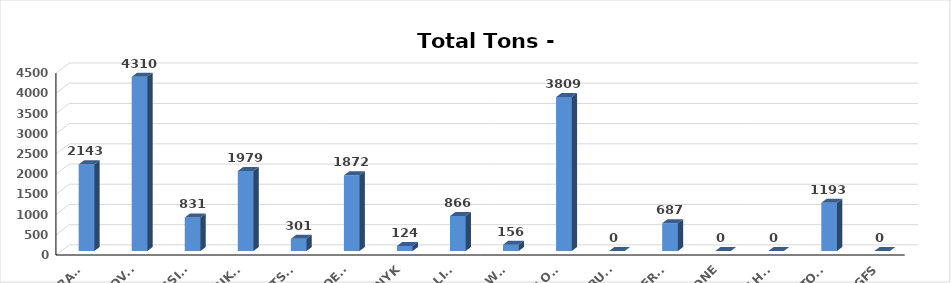
| Category | Series 0 |
|---|---|
| TRAMP | 2143 |
| GLOVIS | 4310 |
| MESSINA | 831 |
| EUKOR | 1979 |
| MITSUI | 301 |
| HUAL-HOEGH | 1872 |
| NYK | 124 |
| K-LINE | 866 |
| WWL | 156 |
| LIBERTY GLOBA | 3809 |
| COSCO BULK | 0 |
| LIBERTY | 687 |
| ONE | 0 |
| WAN HAI | 0 |
| HOEGH AUTOLIN | 1193 |
| GFS | 0 |